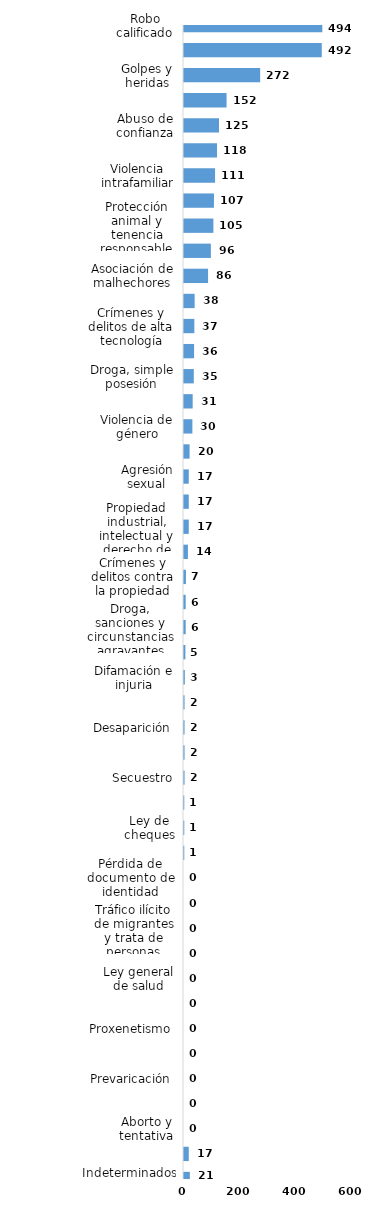
| Category | Series 0 |
|---|---|
| Robo calificado | 494 |
| Amenaza | 492 |
| Golpes y heridas | 272 |
| Daños y perjuicios a la cosa ajena | 152 |
| Abuso de confianza | 125 |
| Código del menor NNA | 118 |
| Violencia intrafamiliar | 111 |
| Estafa | 107 |
| Protección animal y tenencia responsable | 105 |
| Código de trabajo | 96 |
| Asociación de malhechores | 86 |
| Droga, traficante de droga | 38 |
| Crímenes y delitos de alta tecnología | 37 |
| Droga, distribución de droga | 36 |
| Droga, simple posesión | 35 |
| Ley de armas | 31 |
| Violencia de género | 30 |
| Violación sexual | 20 |
| Agresión sexual | 17 |
| Homicidio | 17 |
| Propiedad industrial, intelectual y derecho de autor | 17 |
| Tentativa de homicidio | 14 |
| Crímenes y delitos contra la propiedad | 7 |
| Robo simple | 6 |
| Droga, sanciones y circunstancias agravantes | 6 |
| Falsificación | 5 |
| Difamación e injuria | 3 |
| Tránsito y seguridad vial  | 2 |
| Desaparición | 2 |
| Medio ambiente y recursos naturales | 2 |
| Secuestro | 2 |
| Juegos de azar | 1 |
| Ley de cheques | 1 |
| Terrorismo | 1 |
| Pérdida de documento de identidad | 0 |
| Conflictos sociales | 0 |
| Tráfico ilícito de migrantes y trata de personas | 0 |
| Contra el lavado de activos  | 0 |
| Ley general de salud | 0 |
| Derechos humanos | 0 |
| Proxenetismo | 0 |
| Soborno | 0 |
| Prevaricación | 0 |
| Droga, delitos y sanciones | 0 |
| Aborto y tentativa | 0 |
| Otros | 17 |
| Indeterminados | 21 |